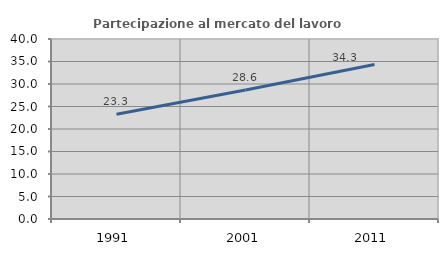
| Category | Partecipazione al mercato del lavoro  femminile |
|---|---|
| 1991.0 | 23.296 |
| 2001.0 | 28.647 |
| 2011.0 | 34.325 |